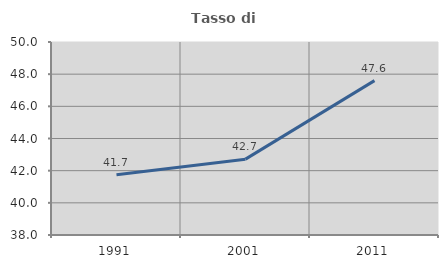
| Category | Tasso di occupazione   |
|---|---|
| 1991.0 | 41.746 |
| 2001.0 | 42.716 |
| 2011.0 | 47.598 |